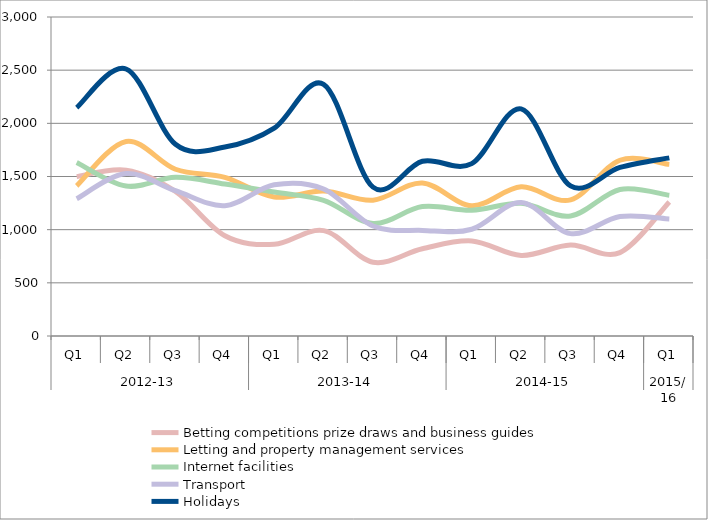
| Category | Betting competitions prize draws and business guides | Letting and property management services | Internet facilities | Transport | Holidays |
|---|---|---|---|---|---|
| 0 | 1499 | 1412 | 1632 | 1291 | 2148 |
| 1 | 1560 | 1830 | 1410 | 1528 | 2511 |
| 2 | 1360 | 1568 | 1492 | 1367 | 1803 |
| 3 | 943 | 1492 | 1429 | 1226 | 1777 |
| 4 | 862 | 1307 | 1354 | 1422 | 1954 |
| 5 | 991 | 1363 | 1276 | 1383 | 2367 |
| 6 | 694 | 1277 | 1059 | 1034 | 1400 |
| 7 | 821 | 1439 | 1217 | 993 | 1643 |
| 8 | 894 | 1226 | 1183 | 1004 | 1621 |
| 9 | 758 | 1403 | 1248 | 1256 | 2136 |
| 10 | 855 | 1280 | 1129 | 963 | 1412 |
| 11 | 784 | 1653 | 1378 | 1123 | 1585 |
| 12 | 1261 | 1614 | 1323 | 1101 | 1675 |